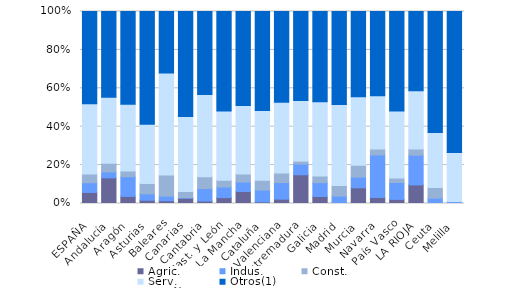
| Category | Agric. | Indus. | Const. | Serv. | Otros(1) |
|---|---|---|---|---|---|
| ESPAÑA | 5.765 | 5.057 | 4.558 | 36.615 | 48.006 |
| Andalucía | 13.377 | 3.047 | 4.552 | 34.317 | 44.707 |
| Aragón | 3.681 | 10.276 | 2.914 | 34.816 | 48.313 |
| Asturias | 1.684 | 3.367 | 5.387 | 30.808 | 58.754 |
| Baleares | 1.433 | 2.389 | 10.987 | 53.185 | 32.006 |
| Canarias | 2.713 | 0.322 | 3.172 | 39.126 | 54.667 |
| Cantabria | 1.299 | 6.494 | 6.169 | 42.857 | 43.182 |
| Cast. y León | 3.078 | 5.525 | 3.552 | 35.991 | 51.855 |
| Cast.-La Mancha | 6.239 | 4.954 | 4.159 | 35.657 | 48.991 |
| Cataluña | 0.838 | 6.161 | 5.126 | 36.299 | 51.577 |
| C. Valenciana | 2.279 | 8.624 | 5.048 | 36.833 | 47.217 |
| Extremadura | 14.983 | 5.565 | 1.541 | 31.592 | 46.318 |
| Galicia | 3.638 | 7.207 | 3.432 | 38.778 | 46.946 |
| Madrid | 0.312 | 3.576 | 5.507 | 42.18 | 48.425 |
| Murcia | 8.191 | 5.546 | 6.229 | 35.58 | 44.454 |
| Navarra | 3.158 | 22.105 | 3.158 | 27.719 | 43.86 |
| País Vasco | 2.144 | 8.789 | 2.358 | 34.941 | 51.768 |
| LA RIOJA | 9.677 | 15.484 | 3.226 | 30.323 | 41.29 |
| Ceuta | 0 | 2.778 | 5.556 | 28.704 | 62.963 |
| Melilla | 0 | 1.02 | 0 | 25.51 | 73.469 |